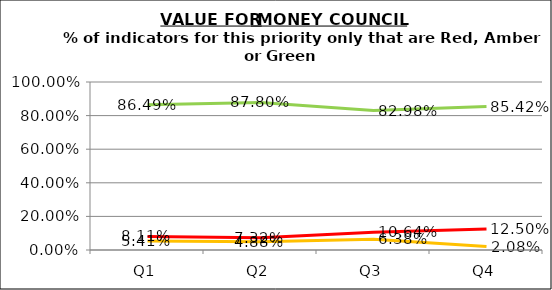
| Category | Green | Amber | Red |
|---|---|---|---|
| Q1 | 0.865 | 0.054 | 0.081 |
| Q2 | 0.878 | 0.049 | 0.073 |
| Q3 | 0.83 | 0.064 | 0.106 |
| Q4 | 0.854 | 0.021 | 0.125 |